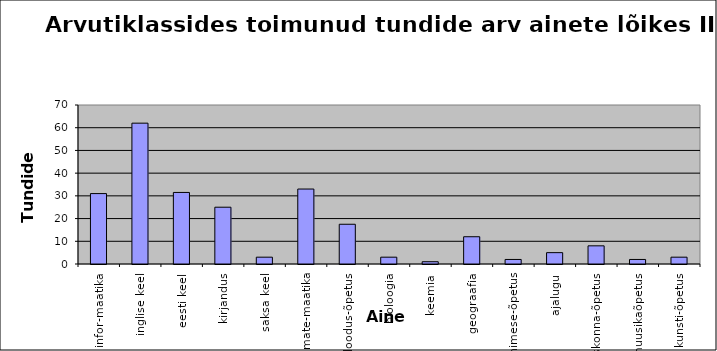
| Category | Series 0 |
|---|---|
| infor-maatika | 31 |
| inglise keel | 62 |
| eesti keel | 31.5 |
| kirjandus | 25 |
| saksa keel | 3 |
| mate-maatika | 33 |
| loodus-õpetus | 17.5 |
| bioloogia | 3 |
| keemia | 1 |
| geograafia | 12 |
| inimese-õpetus | 2 |
| ajalugu | 5 |
| ühiskonna-õpetus | 8 |
| muusikaõpetus | 2 |
| kunsti-õpetus | 3 |